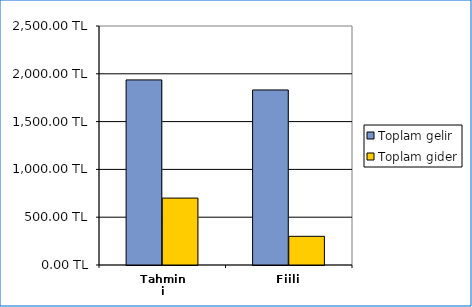
| Category | Toplam gelir | Toplam gider |
|---|---|---|
| Tahmini | 1936 | 700 |
| Fiili | 1831 | 300 |